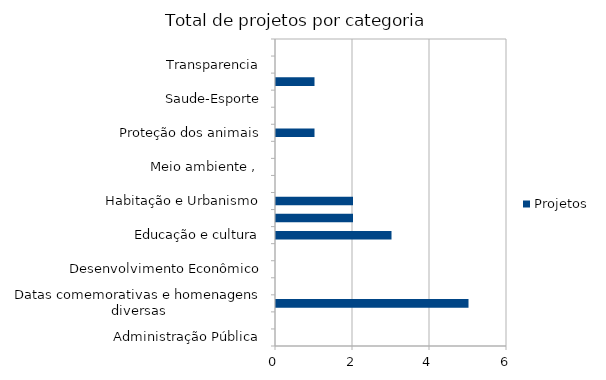
| Category | Projetos |
|---|---|
| Administração Pública | 0 |
| Combate à corrupção | 0 |
| Datas comemorativas e homenagens diversas | 5 |
| Denominação de logradouro | 0 |
| Desenvolvimento Econômico | 0 |
| Desenvolvimento Social | 0 |
| Educação e cultura | 3 |
| Frente parlamentar | 2 |
| Habitação e Urbanismo | 2 |
| Lei Orgânica do Município | 0 |
| Meio ambiente ,  | 0 |
| Mobilidade | 0 |
| Proteção dos animais | 1 |
| Regimento Interno da CMSP | 0 |
| Saude-Esporte | 0 |
| Segurança Pública | 1 |
| Transparencia | 0 |
| Tributação | 0 |